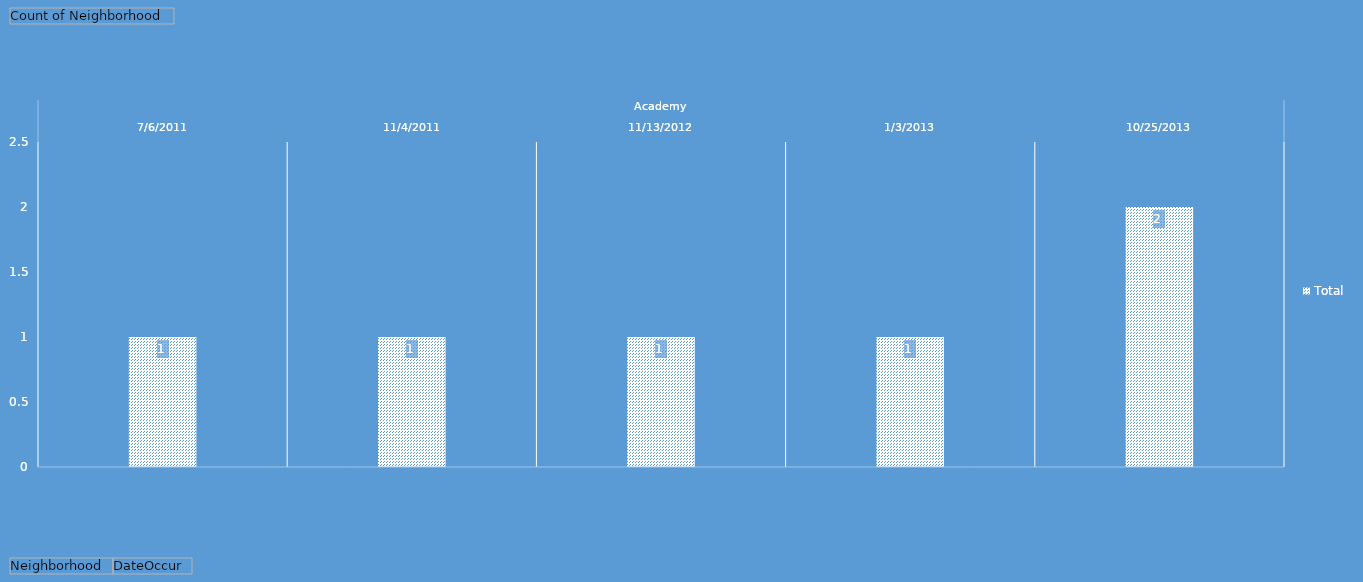
| Category | Total |
|---|---|
| 0 | 1 |
| 1 | 1 |
| 2 | 1 |
| 3 | 1 |
| 4 | 2 |